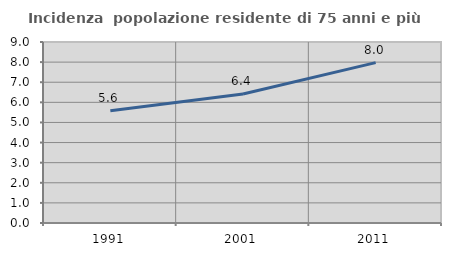
| Category | Incidenza  popolazione residente di 75 anni e più |
|---|---|
| 1991.0 | 5.585 |
| 2001.0 | 6.418 |
| 2011.0 | 7.975 |